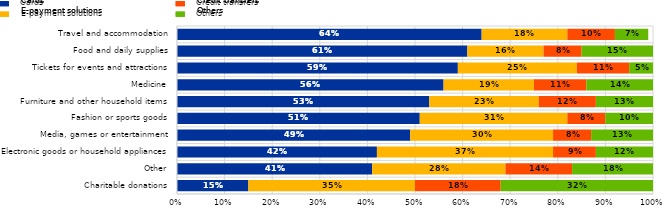
| Category | Cards | E-payment solutions | Credit transfers | Others |
|---|---|---|---|---|
| Charitable donations | 0.15 | 0.35 | 0.18 | 0.32 |
| Other | 0.41 | 0.28 | 0.14 | 0.18 |
| Electronic goods or household appliances | 0.42 | 0.37 | 0.09 | 0.12 |
| Media, games or entertainment | 0.49 | 0.3 | 0.08 | 0.13 |
| Fashion or sports goods | 0.51 | 0.31 | 0.08 | 0.1 |
| Furniture and other household items | 0.53 | 0.23 | 0.12 | 0.13 |
| Medicine | 0.56 | 0.19 | 0.11 | 0.14 |
| Tickets for events and attractions | 0.59 | 0.25 | 0.11 | 0.05 |
| Food and daily supplies | 0.61 | 0.16 | 0.08 | 0.15 |
| Travel and accommodation | 0.64 | 0.18 | 0.1 | 0.07 |